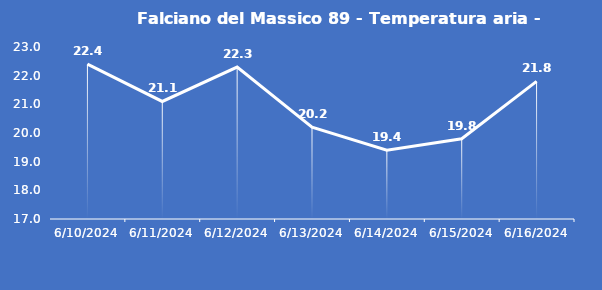
| Category | Falciano del Massico 89 - Temperatura aria - Grezzo (°C) |
|---|---|
| 6/10/24 | 22.4 |
| 6/11/24 | 21.1 |
| 6/12/24 | 22.3 |
| 6/13/24 | 20.2 |
| 6/14/24 | 19.4 |
| 6/15/24 | 19.8 |
| 6/16/24 | 21.8 |